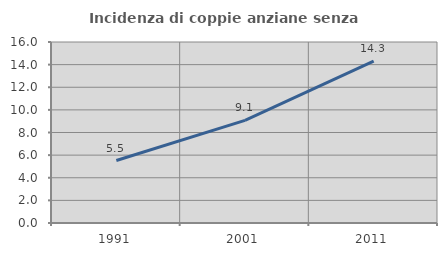
| Category | Incidenza di coppie anziane senza figli  |
|---|---|
| 1991.0 | 5.524 |
| 2001.0 | 9.067 |
| 2011.0 | 14.31 |